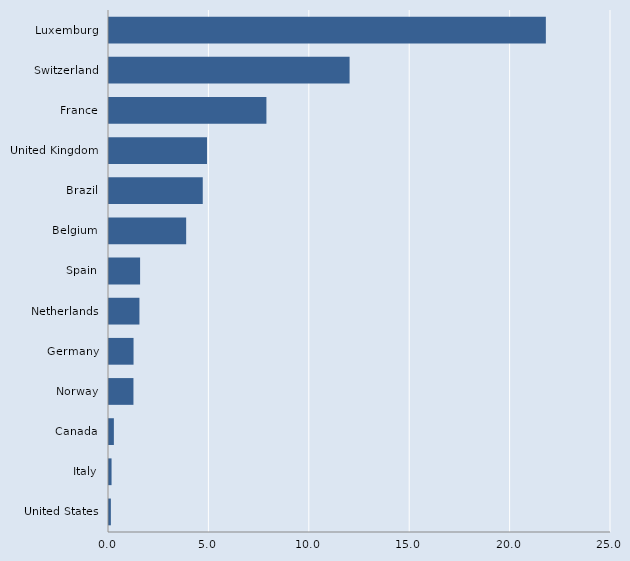
| Category | Series 0 |
|---|---|
| United States | 0.093 |
| Italy | 0.127 |
| Canada | 0.243 |
| Norway | 1.218 |
| Germany | 1.222 |
| Netherlands | 1.516 |
| Spain | 1.549 |
| Belgium | 3.843 |
| Brazil | 4.669 |
| United Kingdom | 4.88 |
| France | 7.84 |
| Switzerland | 11.982 |
| Luxemburg | 21.756 |